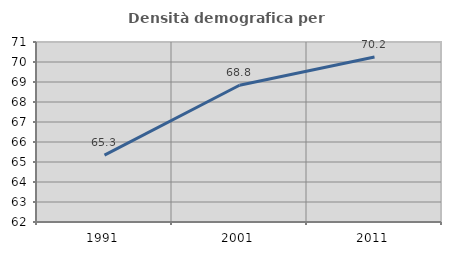
| Category | Densità demografica |
|---|---|
| 1991.0 | 65.343 |
| 2001.0 | 68.838 |
| 2011.0 | 70.247 |